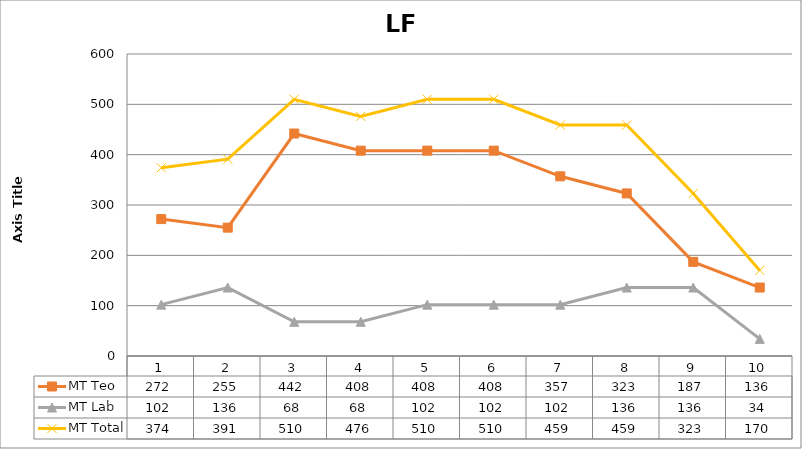
| Category | MT Teo | MT Lab | MT Total |
|---|---|---|---|
| 1.0 | 272 | 102 | 374 |
| 2.0 | 255 | 136 | 391 |
| 3.0 | 442 | 68 | 510 |
| 4.0 | 408 | 68 | 476 |
| 5.0 | 408 | 102 | 510 |
| 6.0 | 408 | 102 | 510 |
| 7.0 | 357 | 102 | 459 |
| 8.0 | 323 | 136 | 459 |
| 9.0 | 187 | 136 | 323 |
| 10.0 | 136 | 34 | 170 |